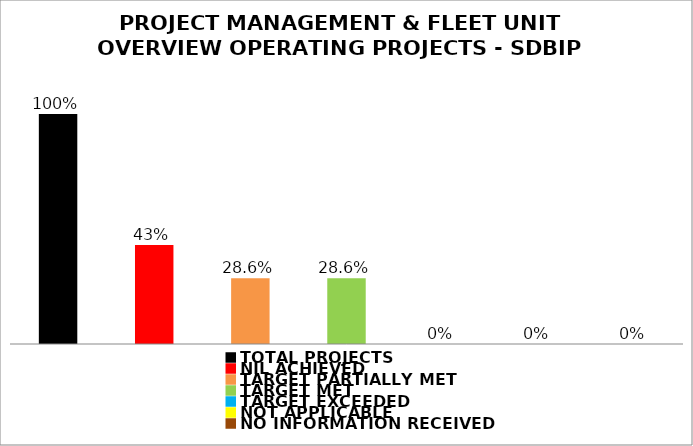
| Category | Series 0 |
|---|---|
| TOTAL PROJECTS | 1 |
| NIL ACHIEVED | 0.43 |
| TARGET PARTIALLY MET | 0.286 |
| TARGET MET | 0.286 |
| TARGET EXCEEDED | 0 |
| NOT APPLICABLE | 0 |
| NO INFORMATION RECEIVED | 0 |